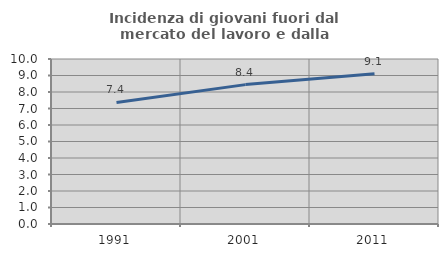
| Category | Incidenza di giovani fuori dal mercato del lavoro e dalla formazione  |
|---|---|
| 1991.0 | 7.365 |
| 2001.0 | 8.448 |
| 2011.0 | 9.105 |